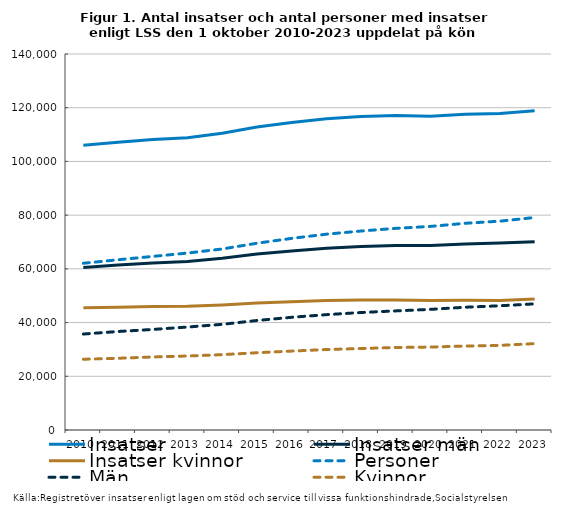
| Category | Insatser | Insatser män | Insatser kvinnor | Personer | Män | Kvinnor |
|---|---|---|---|---|---|---|
| 2010.0 | 106010 | 60516 | 45494 | 62077 | 35733 | 26344 |
| 2011.0 | 107176 | 61480 | 45696 | 63387 | 36675 | 26712 |
| 2012.0 | 108190 | 62186 | 46004 | 64635 | 37447 | 27188 |
| 2013.0 | 108846 | 62780 | 46066 | 65884 | 38334 | 27550 |
| 2014.0 | 110513 | 63958 | 46555 | 67397 | 39342 | 28055 |
| 2015.0 | 112817 | 65526 | 47291 | 69540 | 40773 | 28767 |
| 2016.0 | 114466 | 66678 | 47788 | 71349 | 41965 | 29384 |
| 2017.0 | 115860 | 67668 | 48192 | 72910 | 42945 | 29965 |
| 2018.0 | 116718 | 68356 | 48362 | 74085 | 43744 | 30341 |
| 2019.0 | 117087 | 68670 | 48417 | 75083 | 44348 | 30735 |
| 2020.0 | 116827 | 68652 | 48175 | 75800 | 44918 | 30882 |
| 2021.0 | 117553 | 69263 | 48290 | 76966 | 45713 | 31253 |
| 2022.0 | 117828 | 69585 | 48243 | 77764 | 46255 | 31509 |
| 2023.0 | 118846 | 70103 | 48743 | 79125 | 46965 | 32160 |